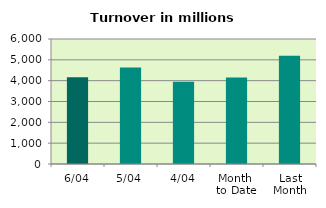
| Category | Series 0 |
|---|---|
| 6/04 | 4160.436 |
| 5/04 | 4637.02 |
| 4/04 | 3945.104 |
| Month 
to Date | 4157.332 |
| Last
Month | 5192.573 |